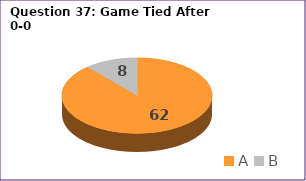
| Category | Series 0 |
|---|---|
| A | 62 |
| B | 8 |